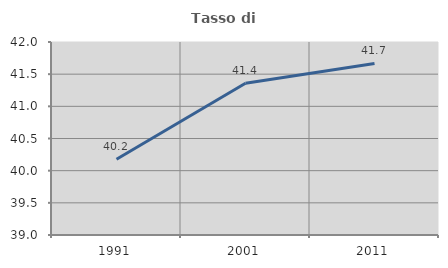
| Category | Tasso di occupazione   |
|---|---|
| 1991.0 | 40.179 |
| 2001.0 | 41.359 |
| 2011.0 | 41.667 |